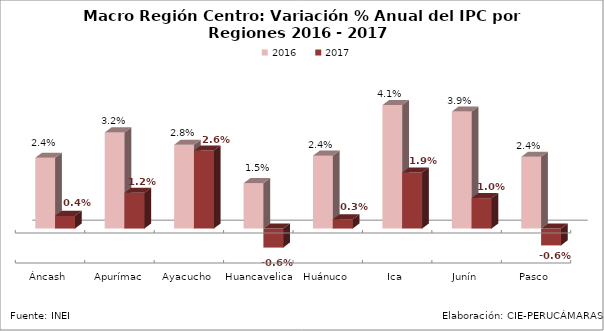
| Category | 2016 | 2017 |
|---|---|---|
| Áncash | 0.024 | 0.004 |
| Apurímac | 0.032 | 0.012 |
| Ayacucho | 0.028 | 0.026 |
| Huancavelica | 0.015 | -0.006 |
| Huánuco | 0.024 | 0.003 |
| Ica | 0.041 | 0.019 |
| Junín | 0.039 | 0.01 |
| Pasco | 0.024 | -0.006 |